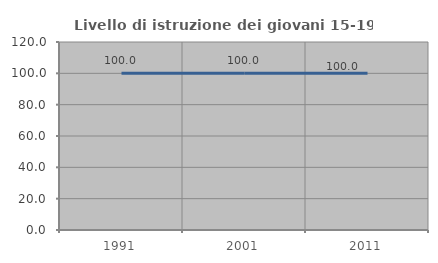
| Category | Livello di istruzione dei giovani 15-19 anni |
|---|---|
| 1991.0 | 100 |
| 2001.0 | 100 |
| 2011.0 | 100 |